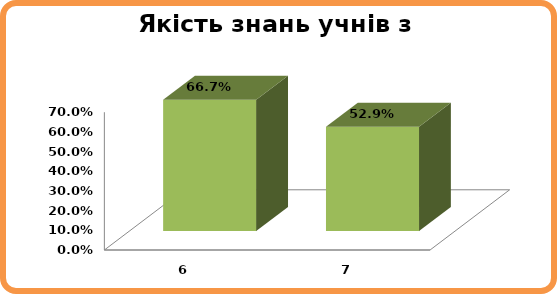
| Category | Series 0 |
|---|---|
| 6.0 | 0.667 |
| 7.0 | 0.529 |